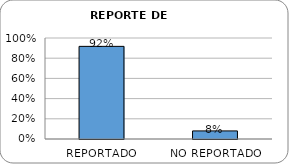
| Category | Series 0 |
|---|---|
| REPORTADO | 0.917 |
| NO REPORTADO | 0.08 |